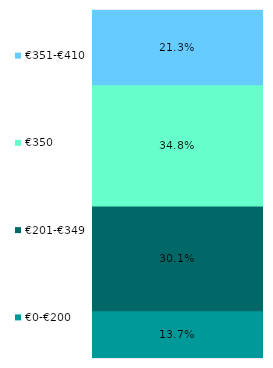
| Category | €0-€200 | €201-€349 | €350 | €351-€410 |
|---|---|---|---|---|
| 0 | 0.137 | 0.301 | 0.348 | 0.213 |